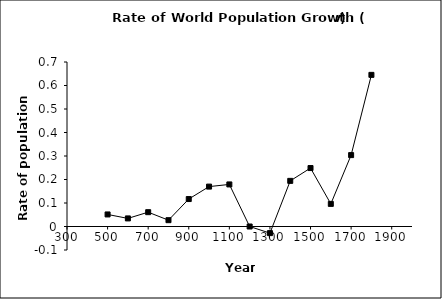
| Category | r |
|---|---|
| 500.0 | 0.051 |
| 600.0 | 0.034 |
| 700.0 | 0.061 |
| 800.0 | 0.027 |
| 900.0 | 0.117 |
| 1000.0 | 0.17 |
| 1100.0 | 0.179 |
| 1200.0 | 0 |
| 1300.0 | -0.028 |
| 1400.0 | 0.194 |
| 1500.0 | 0.249 |
| 1600.0 | 0.096 |
| 1700.0 | 0.304 |
| 1800.0 | 0.645 |